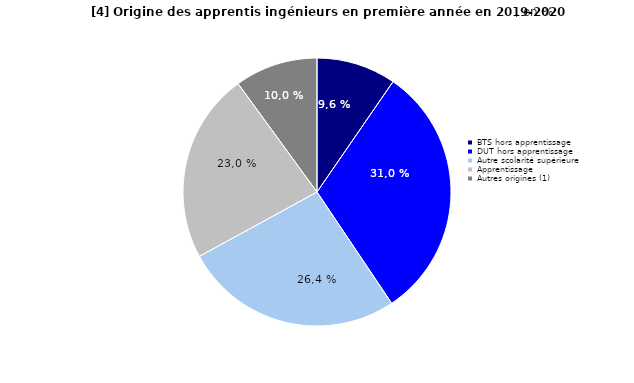
| Category | Series 0 |
|---|---|
| BTS hors apprentissage | 9.6 |
| DUT hors apprentissage | 30.99 |
| Autre scolarité supérieure | 26.43 |
| Apprentissage  | 22.95 |
| Autres origines (1) | 10.02 |